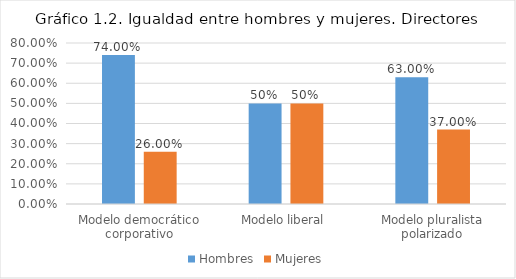
| Category | Hombres | Mujeres |
|---|---|---|
| Modelo democrático corporativo | 0.74 | 0.26 |
| Modelo liberal | 0.5 | 0.5 |
| Modelo pluralista polarizado | 0.63 | 0.37 |